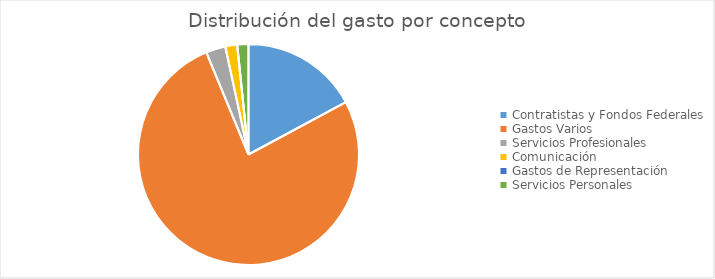
| Category | Series 0 |
|---|---|
| Contratistas y Fondos Federales | 90914647.32 |
| Gastos Varios | 406086793.38 |
| Servicios Profesionales | 15181417.84 |
| Comunicación | 9178635.57 |
| Gastos de Representación | 43103.98 |
| Servicios Personales | 8668247.8 |